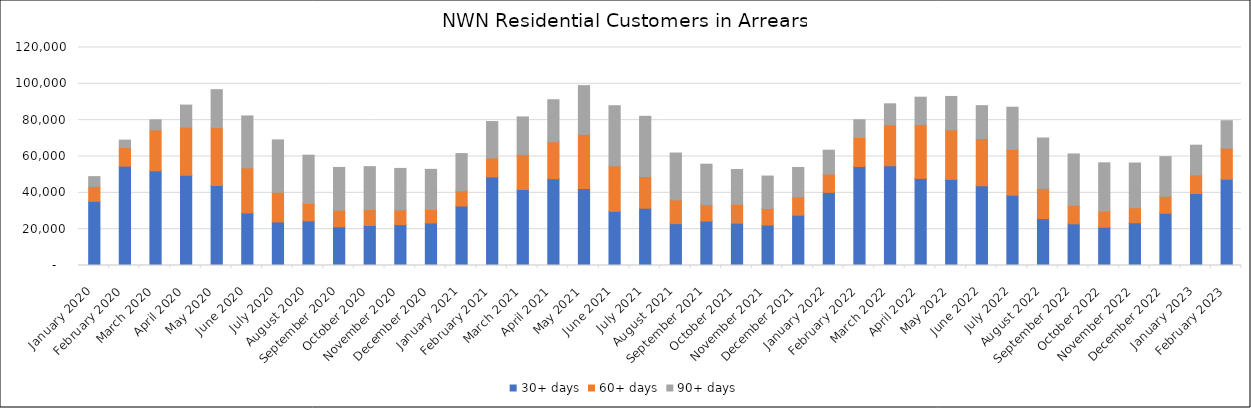
| Category | 30+ days | 60+ days | 90+ days |
|---|---|---|---|
| 2020-01-01 | 35327 | 8203 | 5386 |
| 2020-02-01 | 54673 | 10216 | 4122 |
| 2020-03-01 | 52089 | 22559 | 5533 |
| 2020-04-01 | 49641 | 26524 | 12139 |
| 2020-05-01 | 44049 | 31837 | 20890 |
| 2020-06-01 | 28915 | 24795 | 28618 |
| 2020-07-01 | 23991 | 16324 | 28828 |
| 2020-08-01 | 24563 | 9604 | 26571 |
| 2020-09-01 | 21271 | 9127 | 23592 |
| 2020-10-01 | 22024 | 8731 | 23660 |
| 2020-11-01 | 22467 | 8083 | 22890 |
| 2020-12-01 | 23419 | 7412 | 22087 |
| 2021-01-01 | 32717 | 8439 | 20447 |
| 2021-02-01 | 48755 | 10460 | 20016 |
| 2021-03-01 | 41848 | 19330 | 20614 |
| 2021-04-01 | 47731 | 20398 | 23111 |
| 2021-05-01 | 42334 | 29846 | 26833 |
| 2021-06-01 | 29791 | 25058 | 33104 |
| 2021-07-01 | 31536 | 17464 | 33120 |
| 2021-08-01 | 23046 | 13063 | 25790 |
| 2021-09-01 | 24407 | 9068 | 22297 |
| 2021-10-01 | 23275 | 10471 | 19077 |
| 2021-11-01 | 22243 | 9154 | 17844 |
| 2021-12-01 | 27686 | 10061 | 16222 |
| 2022-01-01 | 40260 | 10072 | 13121 |
| 2022-02-01 | 54492 | 15960 | 9761 |
| 2022-03-01 | 54897 | 22557 | 11547 |
| 2022-04-01 | 47932 | 29563 | 15157 |
| 2022-05-01 | 47369 | 27245 | 18440 |
| 2022-06-01 | 43895 | 25986 | 18119 |
| 2022-07-01 | 38666 | 25249 | 23223 |
| 2022-08-01 | 25790 | 16665 | 27728 |
| 2022-09-01 | 22952 | 10222 | 28235 |
| 2022-10-01 | 21069 | 8958 | 26490 |
| 2022-11-01 | 23531 | 8256 | 24627 |
| 2022-12-01 | 28776 | 9305 | 21833 |
| 2023-01-01 | 39621 | 10221 | 16387 |
| 2023-02-01 | 47491 | 17087 | 15116 |